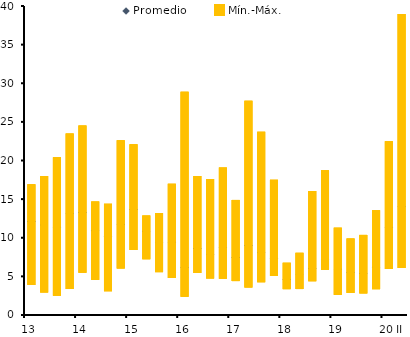
| Category | Mínimo | Promedio | Mín.-Máx. |
|---|---|---|---|
| 13 | 3.875 | 12.1 | 16.927 |
|  | 2.907 | 11.651 | 18.008 |
|  | 2.479 | 11.378 | 20.419 |
|  | 3.368 | 13.098 | 23.511 |
| 14 | 5.479 | 13.277 | 24.528 |
|  | 4.545 | 10.898 | 14.694 |
|  | 3.077 | 10.14 | 14.404 |
|  | 6.014 | 11.68 | 22.632 |
| 15 | 8.429 | 13.632 | 22.093 |
|  | 7.216 | 10.856 | 12.881 |
|  | 5.545 | 9.395 | 13.208 |
|  | 4.803 | 9.436 | 16.976 |
| 16 | 2.367 | 6.118 | 28.889 |
|  | 5.428 | 8.598 | 17.986 |
|  | 4.723 | 7.84 | 17.619 |
|  | 4.687 | 8.713 | 19.085 |
| 17 | 4.391 | 7.443 | 14.894 |
|  | 3.557 | 9.003 | 27.733 |
|  | 4.239 | 8.071 | 23.708 |
|  | 5.05 | 7.345 | 17.498 |
| 18 | 3.344 | 4.583 | 6.767 |
|  | 3.36 | 5.185 | 8.054 |
|  | 4.378 | 6.026 | 16.038 |
|  | 5.846 | 7.175 | 18.726 |
| 19 | 2.608 | 5.946 | 11.304 |
|  | 2.852 | 5.535 | 9.907 |
|  | 2.792 | 5.341 | 10.368 |
|  | 3.336 | 6.201 | 13.564 |
| 20 | 5.954 | 11.36 | 22.5 |
| II | 6.081 | 14.002 | 38.961 |